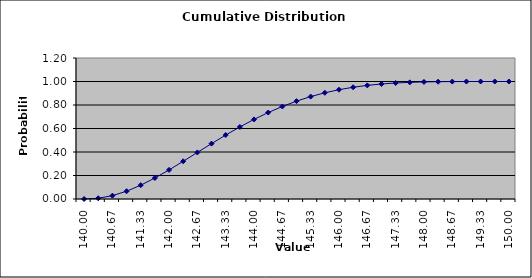
| Category | DISTRIBUTION SCHEDULE |
|---|---|
| 140.0 | 0 |
| 140.33333333333334 | 0.006 |
| 140.66666666666669 | 0.029 |
| 141.00000000000003 | 0.066 |
| 141.33333333333337 | 0.117 |
| 141.6666666666667 | 0.179 |
| 142.00000000000006 | 0.248 |
| 142.3333333333334 | 0.321 |
| 142.66666666666674 | 0.396 |
| 143.00000000000009 | 0.471 |
| 143.33333333333343 | 0.544 |
| 143.66666666666677 | 0.613 |
| 144.0000000000001 | 0.677 |
| 144.33333333333346 | 0.736 |
| 144.6666666666668 | 0.787 |
| 145.00000000000014 | 0.833 |
| 145.33333333333348 | 0.871 |
| 145.66666666666683 | 0.904 |
| 146.00000000000017 | 0.93 |
| 146.3333333333335 | 0.951 |
| 146.66666666666686 | 0.967 |
| 147.0000000000002 | 0.979 |
| 147.33333333333354 | 0.987 |
| 147.66666666666688 | 0.993 |
| 148.00000000000023 | 0.996 |
| 148.33333333333357 | 0.998 |
| 148.6666666666669 | 0.999 |
| 149.00000000000026 | 1 |
| 149.3333333333336 | 1 |
| 149.61904761904788 | 1 |
| 150.0 | 1 |